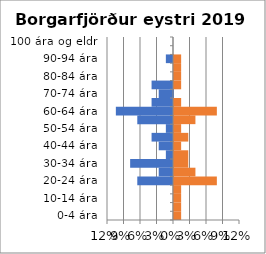
| Category | % karlar | %konur |
|---|---|---|
| 0-4 ára | 0 | 0.013 |
| 5-9 ára | 0 | 0.013 |
| 10-14 ára | 0 | 0.013 |
| 15-19 ára | 0 | 0.013 |
| 20-24 ára | -0.065 | 0.078 |
| 25-29 ára | -0.026 | 0.039 |
| 30-34 ára | -0.078 | 0.026 |
| 35-39 ára | -0.013 | 0.026 |
| 40-44 ára | -0.026 | 0.013 |
| 45-49 ára | -0.039 | 0.026 |
| 50-54 ára | -0.013 | 0.013 |
| 55-59 ára | -0.065 | 0.039 |
| 60-64 ára | -0.104 | 0.078 |
| 65-69 ára | -0.039 | 0.013 |
| 70-74 ára | -0.026 | 0 |
| 75-79 ára | -0.039 | 0.013 |
| 80-84 ára | 0 | 0.013 |
| 85-89 ára | 0 | 0.013 |
| 90-94 ára | -0.013 | 0.013 |
| 95-99 ára | 0 | 0 |
| 100 ára og eldri | 0 | 0 |